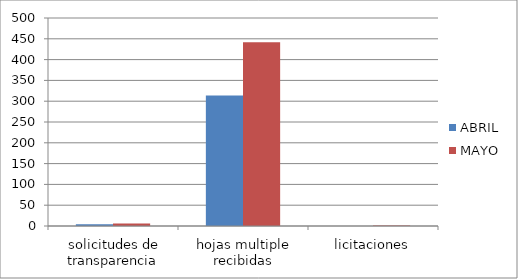
| Category | ABRIL | MAYO |
|---|---|---|
| solicitudes de transparencia | 4 | 6 |
| hojas multiple recibidas | 314 | 442 |
| licitaciones | 0 | 1 |